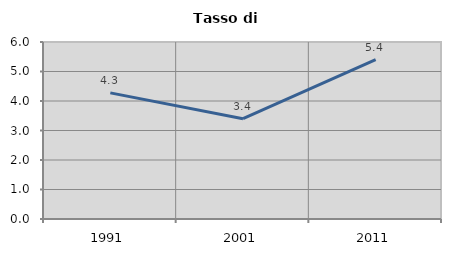
| Category | Tasso di disoccupazione   |
|---|---|
| 1991.0 | 4.276 |
| 2001.0 | 3.399 |
| 2011.0 | 5.405 |